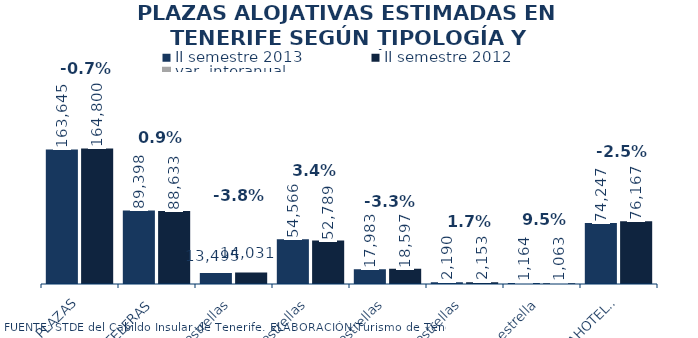
| Category | II semestre 2013 | II semestre 2012 |
|---|---|---|
| TOTAL PLAZAS | 163645 | 164800 |
| HOTELERAS | 89398 | 88633 |
| 5 estrellas | 13495 | 14031 |
| 4 estrellas | 54566 | 52789 |
| 3 estrellas | 17983 | 18597 |
| 2 estrellas | 2190 | 2153 |
| 1 estrella | 1164 | 1063 |
| EXTRAHOTELERAS | 74247 | 76167 |